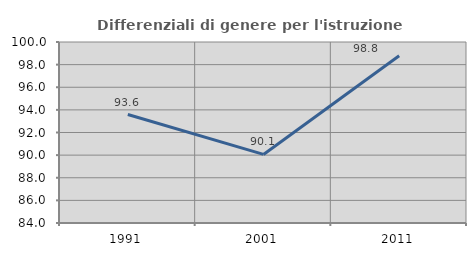
| Category | Differenziali di genere per l'istruzione superiore |
|---|---|
| 1991.0 | 93.591 |
| 2001.0 | 90.063 |
| 2011.0 | 98.787 |